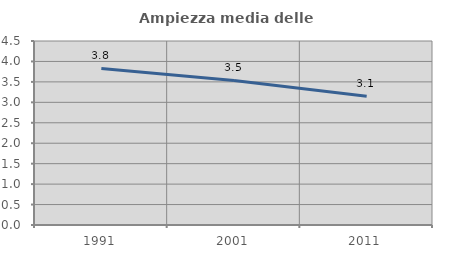
| Category | Ampiezza media delle famiglie |
|---|---|
| 1991.0 | 3.829 |
| 2001.0 | 3.535 |
| 2011.0 | 3.148 |